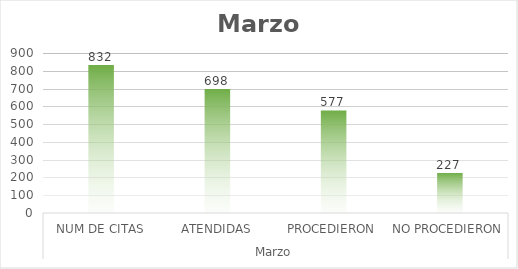
| Category | Series 0 |
|---|---|
| 0 | 832 |
| 1 | 698 |
| 2 | 577 |
| 3 | 227 |